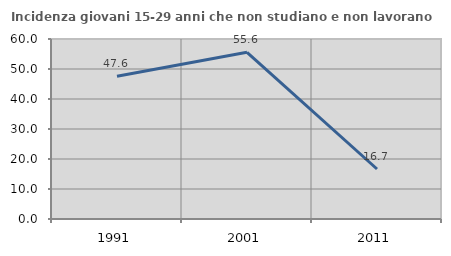
| Category | Incidenza giovani 15-29 anni che non studiano e non lavorano  |
|---|---|
| 1991.0 | 47.582 |
| 2001.0 | 55.556 |
| 2011.0 | 16.667 |